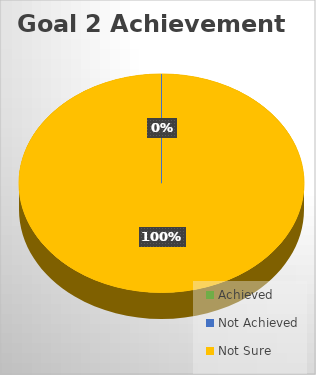
| Category | Goal Achievement | Goals Achieved (%) | Milestones |
|---|---|---|---|
| Achieved | 0 | 0 | 0 |
| Not Achieved | 0 | 0 | 0 |
| Not Sure | 4 | 4 | 0 |